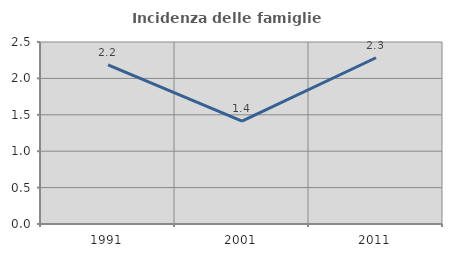
| Category | Incidenza delle famiglie numerose |
|---|---|
| 1991.0 | 2.185 |
| 2001.0 | 1.414 |
| 2011.0 | 2.284 |